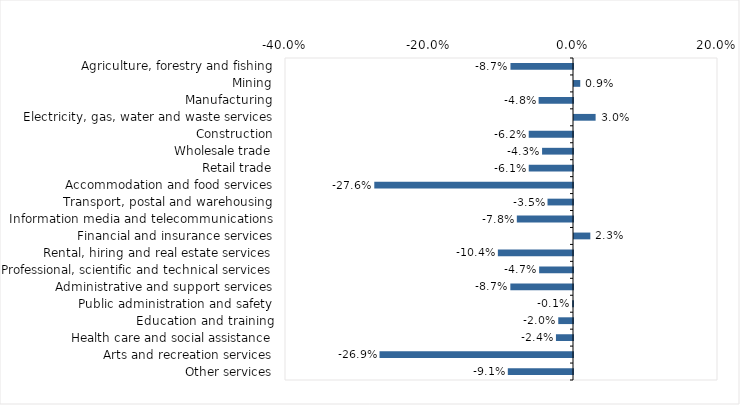
| Category | This week |
|---|---|
| Agriculture, forestry and fishing | -0.087 |
| Mining | 0.009 |
| Manufacturing | -0.048 |
| Electricity, gas, water and waste services | 0.03 |
| Construction | -0.062 |
| Wholesale trade | -0.043 |
| Retail trade | -0.061 |
| Accommodation and food services | -0.276 |
| Transport, postal and warehousing | -0.035 |
| Information media and telecommunications | -0.078 |
| Financial and insurance services | 0.023 |
| Rental, hiring and real estate services | -0.104 |
| Professional, scientific and technical services | -0.047 |
| Administrative and support services | -0.087 |
| Public administration and safety | -0.001 |
| Education and training | -0.02 |
| Health care and social assistance | -0.024 |
| Arts and recreation services | -0.269 |
| Other services | -0.091 |